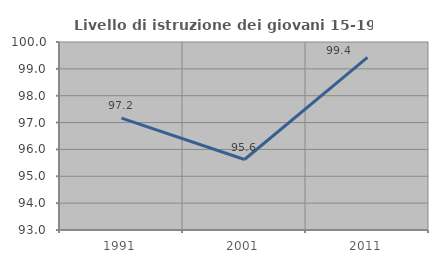
| Category | Livello di istruzione dei giovani 15-19 anni |
|---|---|
| 1991.0 | 97.166 |
| 2001.0 | 95.625 |
| 2011.0 | 99.429 |